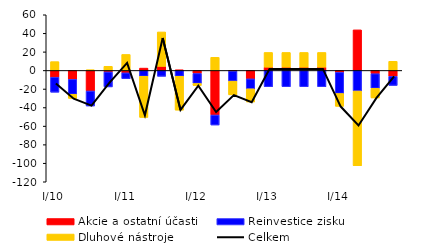
| Category | Akcie a ostatní účasti | Reinvestice zisku | Dluhové nástroje |
|---|---|---|---|
| I/10 | -7.275 | -16.177 | 9.518 |
| II | -9.577 | -16.177 | -4.411 |
| III | -22.133 | -16.177 | 0.669 |
| IV | -1.568 | -16.177 | 4.495 |
| I/11 | -2.569 | -6.291 | 17.255 |
| II | 2.527 | -6.291 | -44.364 |
| III | 4.362 | -6.291 | 37.132 |
| IV | 0.507 | -6.291 | -36.489 |
| I/12 | -3.253 | -10.785 | -2.251 |
| II | -48.016 | -10.785 | 14.16 |
| III | -0.777 | -10.785 | -14.771 |
| IV | -9.051 | -10.785 | -14.161 |
| I/13 | 3.515 | -17.551 | 15.896 |
| II | 3.515 | -17.551 | 15.896 |
| III | 3.515 | -17.551 | 15.896 |
| IV | 3.515 | -17.551 | 15.896 |
| I/14 | -2.088 | -22.755 | -13.843 |
| II | 43.736 | -22.199 | -80.565 |
| III | -3.51 | -15.748 | -10.404 |
| IV | -6.372 | -9.765 | 9.879 |